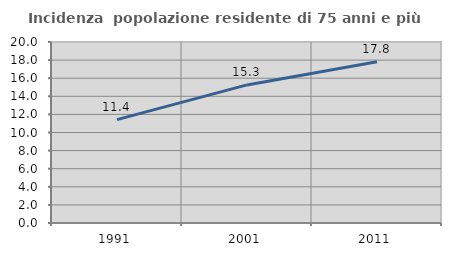
| Category | Incidenza  popolazione residente di 75 anni e più |
|---|---|
| 1991.0 | 11.423 |
| 2001.0 | 15.257 |
| 2011.0 | 17.828 |